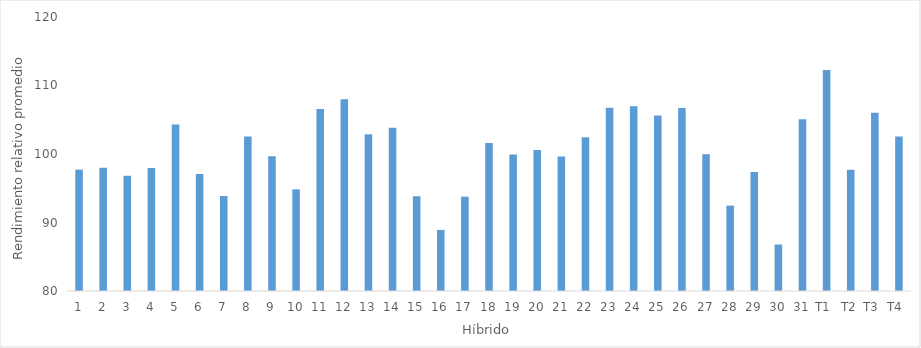
| Category | Series 0 |
|---|---|
| 1 | 97.712 |
| 2 | 97.994 |
| 3 | 96.83 |
| 4 | 97.968 |
| 5 | 104.311 |
| 6 | 97.063 |
| 7 | 93.856 |
| 8 | 102.542 |
| 9 | 99.671 |
| 10 | 94.847 |
| 11 | 106.584 |
| 12 | 108.003 |
| 13 | 102.892 |
| 14 | 103.821 |
| 15 | 93.839 |
| 16 | 88.914 |
| 17 | 93.77 |
| 18 | 101.61 |
| 19 | 99.923 |
| 20 | 100.582 |
| 21 | 99.63 |
| 22 | 102.46 |
| 23 | 106.743 |
| 24 | 106.965 |
| 25 | 105.619 |
| 26 | 106.706 |
| 27 | 99.98 |
| 28 | 92.464 |
| 29 | 97.367 |
| 30 | 86.786 |
| 31 | 105.063 |
| T1    | 112.28 |
| T2 | 97.703 |
| T3    | 106.032 |
| T4    | 102.567 |